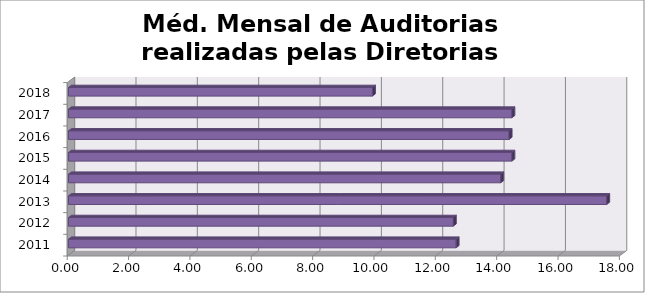
| Category | Méd. Mensal |
|---|---|
| 2011.0 | 12.636 |
| 2012.0 | 12.545 |
| 2013.0 | 17.545 |
| 2014.0 | 14.091 |
| 2015.0 | 14.455 |
| 2016.0 | 14.364 |
| 2017.0 | 14.455 |
| 2018.0 | 9.909 |